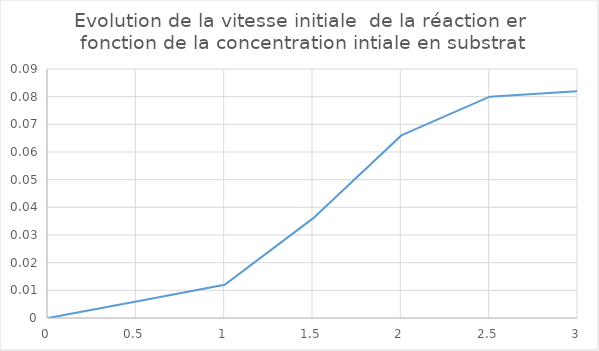
| Category | Series 0 |
|---|---|
| 0.0 | 0 |
| 0.5 | 0.006 |
| 1.0 | 0.012 |
| 1.5 | 0.036 |
| 2.0 | 0.066 |
| 2.5 | 0.08 |
| 3.0 | 0.082 |